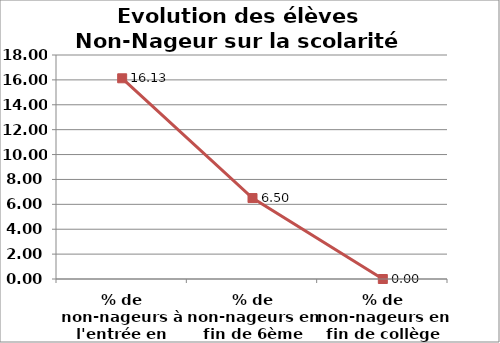
| Category | % de Non Nageur |
|---|---|
| % de non-nageurs à l'entrée en 6ème | 16.129 |
| % de non-nageurs en fin de 6ème (après 2 cycles) | 6.504 |
| % de non-nageurs en fin de collège (après 3 cycles) | 0 |